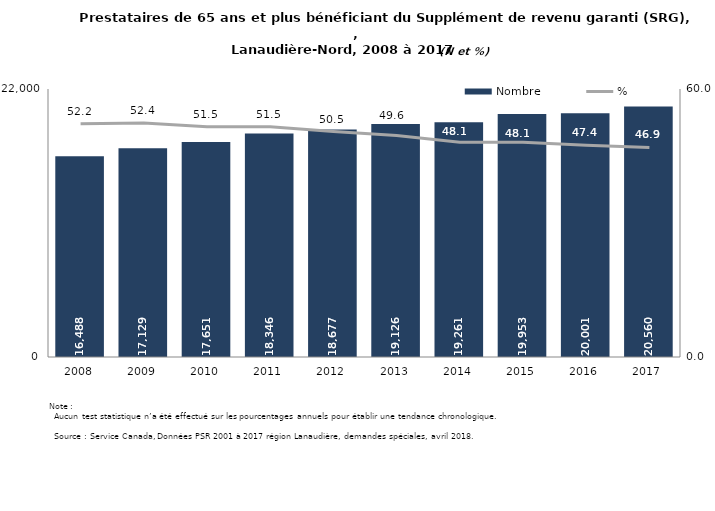
| Category | Nombre |
|---|---|
| 2008.0 | 16488 |
| 2009.0 | 17129 |
| 2010.0 | 17651 |
| 2011.0 | 18346 |
| 2012.0 | 18677 |
| 2013.0 | 19126 |
| 2014.0 | 19261 |
| 2015.0 | 19953 |
| 2016.0 | 20001 |
| 2017.0 | 20560 |